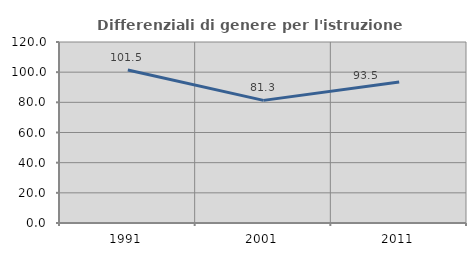
| Category | Differenziali di genere per l'istruzione superiore |
|---|---|
| 1991.0 | 101.466 |
| 2001.0 | 81.298 |
| 2011.0 | 93.462 |